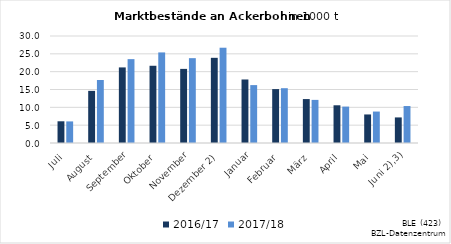
| Category | 2016/17 | 2017/18 |
|---|---|---|
| Juli | 6.087 | 6.054 |
| August | 14.617 | 17.665 |
| September | 21.191 | 23.514 |
| Oktober | 21.654 | 25.397 |
| November | 20.779 | 23.787 |
|  Dezember 2) | 23.883 | 26.714 |
| Januar | 17.808 | 16.234 |
| Februar | 15.113 | 15.366 |
| März | 12.317 | 12.087 |
| April | 10.576 | 10.206 |
| Mai | 8.004 | 8.818 |
|    Juni 2),3) | 7.172 | 10.363 |